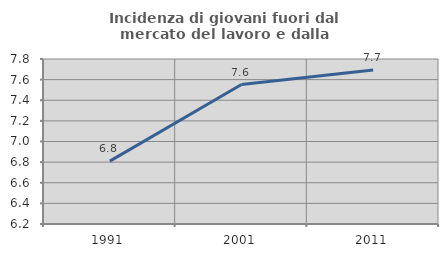
| Category | Incidenza di giovani fuori dal mercato del lavoro e dalla formazione  |
|---|---|
| 1991.0 | 6.809 |
| 2001.0 | 7.552 |
| 2011.0 | 7.692 |